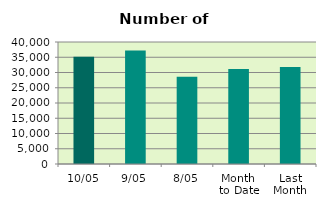
| Category | Series 0 |
|---|---|
| 10/05 | 35196 |
| 9/05 | 37228 |
| 8/05 | 28582 |
| Month 
to Date | 31153.143 |
| Last
Month | 31788.9 |